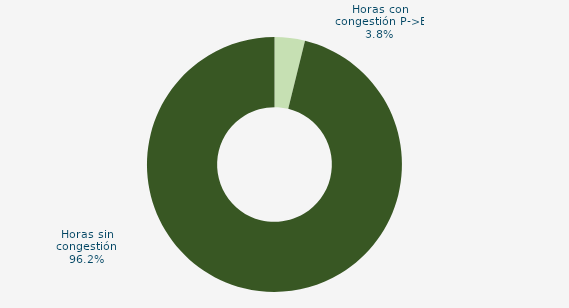
| Category | Horas con congestión E->P |
|---|---|
| Horas con congestión E->P | 0 |
| Horas con congestión P->E | 3.629 |
| Horas sin congestión | 90.726 |